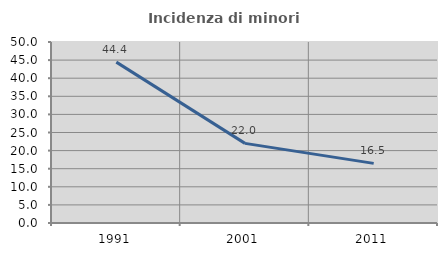
| Category | Incidenza di minori stranieri |
|---|---|
| 1991.0 | 44.444 |
| 2001.0 | 22 |
| 2011.0 | 16.471 |